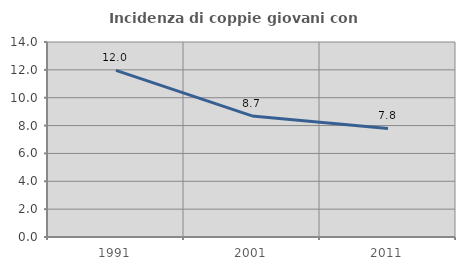
| Category | Incidenza di coppie giovani con figli |
|---|---|
| 1991.0 | 11.966 |
| 2001.0 | 8.696 |
| 2011.0 | 7.792 |